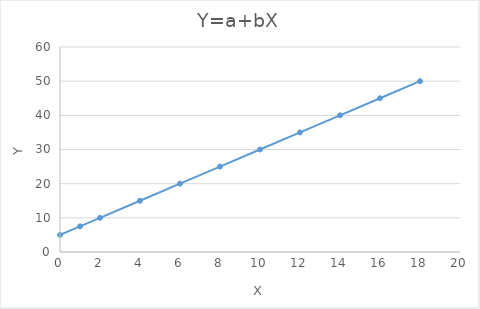
| Category | Y=a+bX |
|---|---|
| 0.0 | 5 |
| 1.0 | 7.5 |
| 2.0 | 10 |
| 4.0 | 15 |
| 6.0 | 20 |
| 8.0 | 25 |
| 10.0 | 30 |
| 12.0 | 35 |
| 14.0 | 40 |
| 16.0 | 45 |
| 18.0 | 50 |